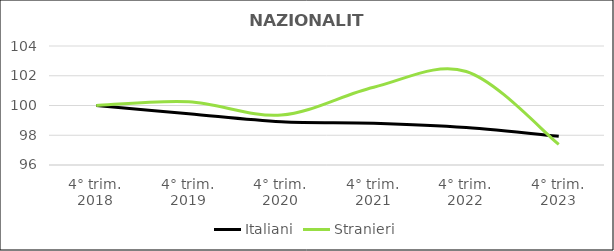
| Category | Italiani | Stranieri |
|---|---|---|
| 4° trim.
2018 | 100 | 100 |
| 4° trim.
2019 | 99.444 | 100.257 |
| 4° trim.
2020 | 98.906 | 99.357 |
| 4° trim.
2021 | 98.811 | 101.229 |
| 4° trim.
2022 | 98.517 | 102.286 |
| 4° trim.
2023 | 97.925 | 97.386 |